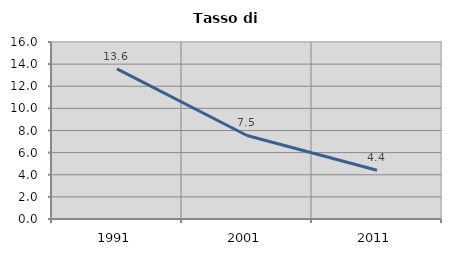
| Category | Tasso di disoccupazione   |
|---|---|
| 1991.0 | 13.57 |
| 2001.0 | 7.549 |
| 2011.0 | 4.413 |